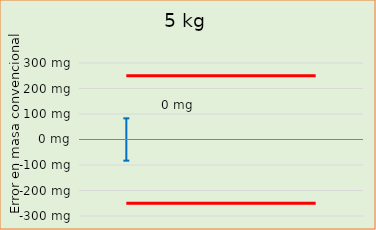
| Category | Error en masa convencional  |  ± EMP |
|---|---|---|
| 0 |  | -250 |
| 1 |  | -250 |
| 2 |  | -250 |